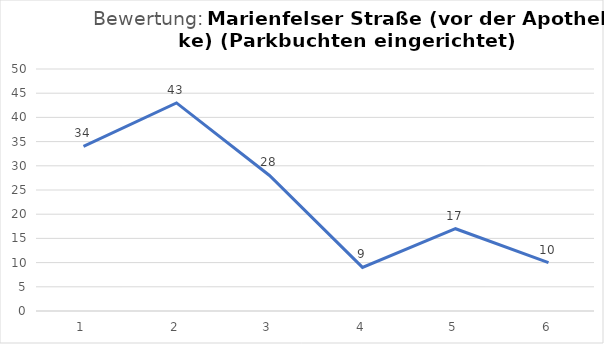
| Category | Series 0 |
|---|---|
| 1.0 | 34 |
| 2.0 | 43 |
| 3.0 | 28 |
| 4.0 | 9 |
| 5.0 | 17 |
| 6.0 | 10 |